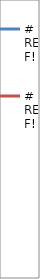
| Category | #REF! |
|---|---|
| 0 | 0.121 |
| 1 | 0.076 |
| 2 | 0.082 |
| 3 | 0.04 |
| 4 | 0.11 |
| 5 | 0.113 |
| 6 | -0.113 |
| 7 | -0.105 |
| 8 | -0.062 |
| 9 | -0.104 |
| 10 | -0.105 |
| 11 | -0.087 |
| 12 | -0.078 |
| 13 | -0.058 |
| 14 | -0.102 |
| 15 | -0.115 |
| 16 | 0.028 |
| 17 | 0.033 |
| 18 | 0.122 |
| 19 | 0.564 |
| 20 | 0.011 |
| 21 | 0.035 |
| 22 | -0.098 |
| 23 | 0.035 |
| 24 | -0.033 |
| 25 | -0.044 |
| 26 | -0.044 |
| 27 | -0.092 |
| 28 | -0.092 |
| 29 | -0.038 |